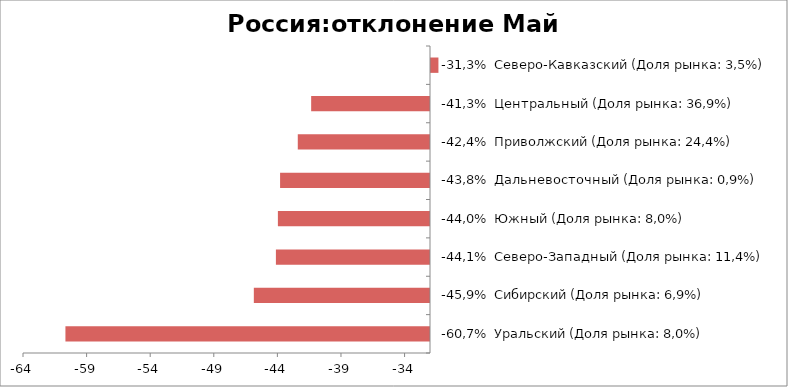
| Category | Россия:отклонение Май 2015-2014 |
|---|---|
| -60,7%  Уральский (Доля рынка: 8,0%) | -60.664 |
| -45,9%  Сибирский (Доля рынка: 6,9%) | -45.851 |
| -44,1%  Северо-Западный (Доля рынка: 11,4%) | -44.116 |
| -44,0%  Южный (Доля рынка: 8,0%) | -43.96 |
| -43,8%  Дальневосточный (Доля рынка: 0,9%) | -43.787 |
| -42,4%  Приволжский (Доля рынка: 24,4%) | -42.396 |
| -41,3%  Центральный (Доля рынка: 36,9%) | -41.344 |
| -31,3%  Северо-Кавказский (Доля рынка: 3,5%) | -31.338 |